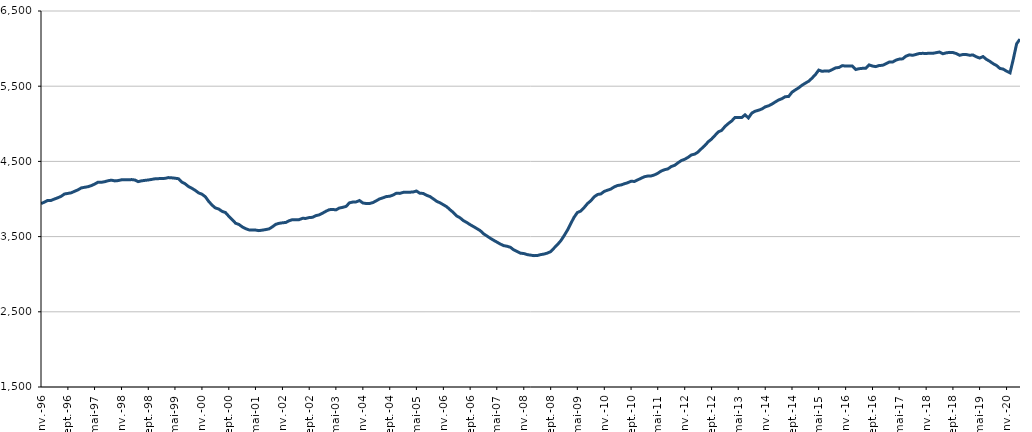
| Category | DEFM ABC |
|---|---|
| 1996-01-01 | 3939.2 |
| 1996-02-01 | 3958.5 |
| 1996-03-01 | 3981.3 |
| 1996-04-01 | 3981.6 |
| 1996-05-01 | 3999.2 |
| 1996-06-01 | 4016.3 |
| 1996-07-01 | 4035.1 |
| 1996-08-01 | 4066.7 |
| 1996-09-01 | 4074.5 |
| 1996-10-01 | 4082.5 |
| 1996-11-01 | 4102.6 |
| 1996-12-01 | 4121.5 |
| 1997-01-01 | 4147.8 |
| 1997-02-01 | 4156.1 |
| 1997-03-01 | 4163.3 |
| 1997-04-01 | 4177.4 |
| 1997-05-01 | 4197.9 |
| 1997-06-01 | 4223.4 |
| 1997-07-01 | 4221.8 |
| 1997-08-01 | 4230.2 |
| 1997-09-01 | 4243 |
| 1997-10-01 | 4250.4 |
| 1997-11-01 | 4240.7 |
| 1997-12-01 | 4245 |
| 1998-01-01 | 4255.2 |
| 1998-02-01 | 4256.8 |
| 1998-03-01 | 4254.6 |
| 1998-04-01 | 4258.2 |
| 1998-05-01 | 4252.8 |
| 1998-06-01 | 4231.1 |
| 1998-07-01 | 4241.6 |
| 1998-08-01 | 4247.6 |
| 1998-09-01 | 4253.2 |
| 1998-10-01 | 4260.5 |
| 1998-11-01 | 4268.6 |
| 1998-12-01 | 4270.8 |
| 1999-01-01 | 4272.2 |
| 1999-02-01 | 4274.7 |
| 1999-03-01 | 4284.6 |
| 1999-04-01 | 4281.6 |
| 1999-05-01 | 4276.6 |
| 1999-06-01 | 4269.6 |
| 1999-07-01 | 4225.9 |
| 1999-08-01 | 4202 |
| 1999-09-01 | 4165.5 |
| 1999-10-01 | 4142.4 |
| 1999-11-01 | 4114.5 |
| 1999-12-01 | 4081.5 |
| 2000-01-01 | 4063.5 |
| 2000-02-01 | 4029.1 |
| 2000-03-01 | 3970 |
| 2000-04-01 | 3919.5 |
| 2000-05-01 | 3881.2 |
| 2000-06-01 | 3866.9 |
| 2000-07-01 | 3836 |
| 2000-08-01 | 3820.2 |
| 2000-09-01 | 3769.4 |
| 2000-10-01 | 3726 |
| 2000-11-01 | 3677.7 |
| 2000-12-01 | 3661.9 |
| 2001-01-01 | 3628.8 |
| 2001-02-01 | 3605.7 |
| 2001-03-01 | 3589.6 |
| 2001-04-01 | 3586.3 |
| 2001-05-01 | 3586.6 |
| 2001-06-01 | 3579.5 |
| 2001-07-01 | 3585.5 |
| 2001-08-01 | 3593.3 |
| 2001-09-01 | 3602.4 |
| 2001-10-01 | 3629.4 |
| 2001-11-01 | 3663.3 |
| 2001-12-01 | 3676.5 |
| 2002-01-01 | 3683.5 |
| 2002-02-01 | 3688.4 |
| 2002-03-01 | 3710.5 |
| 2002-04-01 | 3725.5 |
| 2002-05-01 | 3725.6 |
| 2002-06-01 | 3725.6 |
| 2002-07-01 | 3742.4 |
| 2002-08-01 | 3742.3 |
| 2002-09-01 | 3753.6 |
| 2002-10-01 | 3756.4 |
| 2002-11-01 | 3779.3 |
| 2002-12-01 | 3789.1 |
| 2003-01-01 | 3812.7 |
| 2003-02-01 | 3838.3 |
| 2003-03-01 | 3857.6 |
| 2003-04-01 | 3861.8 |
| 2003-05-01 | 3855.1 |
| 2003-06-01 | 3880 |
| 2003-07-01 | 3888.8 |
| 2003-08-01 | 3901.5 |
| 2003-09-01 | 3949 |
| 2003-10-01 | 3959.2 |
| 2003-11-01 | 3961.7 |
| 2003-12-01 | 3979.5 |
| 2004-01-01 | 3946.7 |
| 2004-02-01 | 3940.2 |
| 2004-03-01 | 3940.2 |
| 2004-04-01 | 3952.5 |
| 2004-05-01 | 3975.7 |
| 2004-06-01 | 4001.7 |
| 2004-07-01 | 4015.8 |
| 2004-08-01 | 4032.7 |
| 2004-09-01 | 4036.6 |
| 2004-10-01 | 4052.9 |
| 2004-11-01 | 4077.6 |
| 2004-12-01 | 4074.5 |
| 2005-01-01 | 4088.2 |
| 2005-02-01 | 4089.2 |
| 2005-03-01 | 4090.5 |
| 2005-04-01 | 4093.2 |
| 2005-05-01 | 4106.4 |
| 2005-06-01 | 4076.4 |
| 2005-07-01 | 4074.2 |
| 2005-08-01 | 4049.4 |
| 2005-09-01 | 4032.3 |
| 2005-10-01 | 4002.4 |
| 2005-11-01 | 3968.6 |
| 2005-12-01 | 3949.6 |
| 2006-01-01 | 3923 |
| 2006-02-01 | 3896.2 |
| 2006-03-01 | 3858.4 |
| 2006-04-01 | 3820.6 |
| 2006-05-01 | 3774.9 |
| 2006-06-01 | 3749.9 |
| 2006-07-01 | 3712.7 |
| 2006-08-01 | 3687.7 |
| 2006-09-01 | 3658.3 |
| 2006-10-01 | 3633.1 |
| 2006-11-01 | 3606 |
| 2006-12-01 | 3579.5 |
| 2007-01-01 | 3536.6 |
| 2007-02-01 | 3507.1 |
| 2007-03-01 | 3479.5 |
| 2007-04-01 | 3451.8 |
| 2007-05-01 | 3427.3 |
| 2007-06-01 | 3401.3 |
| 2007-07-01 | 3380.2 |
| 2007-08-01 | 3372 |
| 2007-09-01 | 3357.9 |
| 2007-10-01 | 3324 |
| 2007-11-01 | 3301.4 |
| 2007-12-01 | 3279.6 |
| 2008-01-01 | 3274.8 |
| 2008-02-01 | 3260.5 |
| 2008-03-01 | 3253.9 |
| 2008-04-01 | 3246.9 |
| 2008-05-01 | 3247.6 |
| 2008-06-01 | 3260 |
| 2008-07-01 | 3267.3 |
| 2008-08-01 | 3280.6 |
| 2008-09-01 | 3300.4 |
| 2008-10-01 | 3346.9 |
| 2008-11-01 | 3392.9 |
| 2008-12-01 | 3444 |
| 2009-01-01 | 3512.7 |
| 2009-02-01 | 3588.5 |
| 2009-03-01 | 3670.4 |
| 2009-04-01 | 3756.7 |
| 2009-05-01 | 3820.1 |
| 2009-06-01 | 3839.5 |
| 2009-07-01 | 3885.4 |
| 2009-08-01 | 3939.3 |
| 2009-09-01 | 3977.5 |
| 2009-10-01 | 4029.4 |
| 2009-11-01 | 4060.1 |
| 2009-12-01 | 4067.9 |
| 2010-01-01 | 4102.2 |
| 2010-02-01 | 4117.7 |
| 2010-03-01 | 4132.6 |
| 2010-04-01 | 4161 |
| 2010-05-01 | 4179.6 |
| 2010-06-01 | 4186.8 |
| 2010-07-01 | 4202 |
| 2010-08-01 | 4216.7 |
| 2010-09-01 | 4236 |
| 2010-10-01 | 4233.4 |
| 2010-11-01 | 4255.1 |
| 2010-12-01 | 4276.2 |
| 2011-01-01 | 4296.7 |
| 2011-02-01 | 4305.6 |
| 2011-03-01 | 4306.4 |
| 2011-04-01 | 4320.6 |
| 2011-05-01 | 4342 |
| 2011-06-01 | 4371.6 |
| 2011-07-01 | 4389.2 |
| 2011-08-01 | 4400.4 |
| 2011-09-01 | 4432.1 |
| 2011-10-01 | 4447.5 |
| 2011-11-01 | 4481.6 |
| 2011-12-01 | 4511.4 |
| 2012-01-01 | 4528.6 |
| 2012-02-01 | 4555 |
| 2012-03-01 | 4585.9 |
| 2012-04-01 | 4597.3 |
| 2012-05-01 | 4624.7 |
| 2012-06-01 | 4669.9 |
| 2012-07-01 | 4710.4 |
| 2012-08-01 | 4761.3 |
| 2012-09-01 | 4797.5 |
| 2012-10-01 | 4845 |
| 2012-11-01 | 4892.3 |
| 2012-12-01 | 4912.9 |
| 2013-01-01 | 4965.5 |
| 2013-02-01 | 5005.2 |
| 2013-03-01 | 5036.2 |
| 2013-04-01 | 5082.8 |
| 2013-05-01 | 5083.1 |
| 2013-06-01 | 5082.8 |
| 2013-07-01 | 5119.2 |
| 2013-08-01 | 5078.3 |
| 2013-09-01 | 5142.8 |
| 2013-10-01 | 5167.7 |
| 2013-11-01 | 5180.3 |
| 2013-12-01 | 5197 |
| 2014-01-01 | 5225.8 |
| 2014-02-01 | 5239.6 |
| 2014-03-01 | 5260.8 |
| 2014-04-01 | 5289.5 |
| 2014-05-01 | 5316.4 |
| 2014-06-01 | 5333.8 |
| 2014-07-01 | 5360.3 |
| 2014-08-01 | 5363.2 |
| 2014-09-01 | 5420.9 |
| 2014-10-01 | 5450.8 |
| 2014-11-01 | 5479.5 |
| 2014-12-01 | 5513.6 |
| 2015-01-01 | 5541.6 |
| 2015-02-01 | 5568 |
| 2015-03-01 | 5606.6 |
| 2015-04-01 | 5654 |
| 2015-05-01 | 5713.9 |
| 2015-06-01 | 5698 |
| 2015-07-01 | 5703.4 |
| 2015-08-01 | 5700 |
| 2015-09-01 | 5720.4 |
| 2015-10-01 | 5743.4 |
| 2015-11-01 | 5749.1 |
| 2015-12-01 | 5773.4 |
| 2016-01-01 | 5767.3 |
| 2016-02-01 | 5768.3 |
| 2016-03-01 | 5767.2 |
| 2016-04-01 | 5721.9 |
| 2016-05-01 | 5732.6 |
| 2016-06-01 | 5737.4 |
| 2016-07-01 | 5739.1 |
| 2016-08-01 | 5782.9 |
| 2016-09-01 | 5767.8 |
| 2016-10-01 | 5760.3 |
| 2016-11-01 | 5775.4 |
| 2016-12-01 | 5777.9 |
| 2017-01-01 | 5798.7 |
| 2017-02-01 | 5822.4 |
| 2017-03-01 | 5820.8 |
| 2017-04-01 | 5846.3 |
| 2017-05-01 | 5860.3 |
| 2017-06-01 | 5863.7 |
| 2017-07-01 | 5899.3 |
| 2017-08-01 | 5916.8 |
| 2017-09-01 | 5910.9 |
| 2017-10-01 | 5922.7 |
| 2017-11-01 | 5935.6 |
| 2017-12-01 | 5936.8 |
| 2018-01-01 | 5935.2 |
| 2018-02-01 | 5939.1 |
| 2018-03-01 | 5937.3 |
| 2018-04-01 | 5945.5 |
| 2018-05-01 | 5954.8 |
| 2018-06-01 | 5931.3 |
| 2018-07-01 | 5943.3 |
| 2018-08-01 | 5949.8 |
| 2018-09-01 | 5948 |
| 2018-10-01 | 5933.7 |
| 2018-11-01 | 5910.7 |
| 2018-12-01 | 5921.9 |
| 2019-01-01 | 5920.5 |
| 2019-02-01 | 5911.2 |
| 2019-03-01 | 5915.7 |
| 2019-04-01 | 5891.1 |
| 2019-05-01 | 5874.3 |
| 2019-06-01 | 5893.9 |
| 2019-07-01 | 5857.4 |
| 2019-08-01 | 5831.2 |
| 2019-09-01 | 5799.1 |
| 2019-10-01 | 5775.8 |
| 2019-11-01 | 5736.2 |
| 2019-12-01 | 5727.2 |
| 2020-01-01 | 5699.7 |
| 2020-02-01 | 5677.6 |
| 2020-03-01 | 5855.1 |
| 2020-04-01 | 6064.4 |
| 2020-05-01 | 6125.4 |